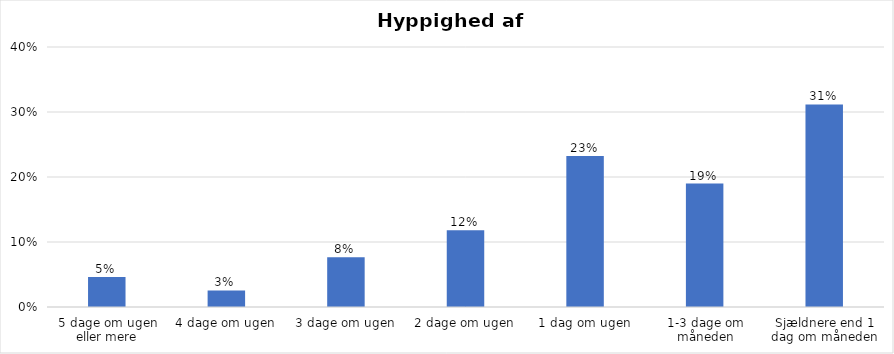
| Category | % |
|---|---|
| 5 dage om ugen eller mere | 0.046 |
| 4 dage om ugen | 0.025 |
| 3 dage om ugen | 0.076 |
| 2 dage om ugen | 0.118 |
| 1 dag om ugen | 0.232 |
| 1-3 dage om måneden | 0.19 |
| Sjældnere end 1 dag om måneden | 0.312 |